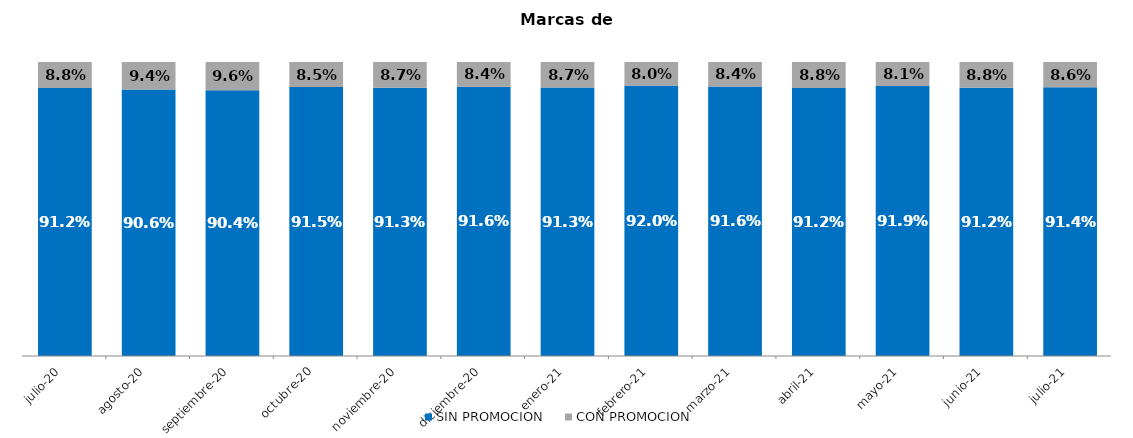
| Category | SIN PROMOCION   | CON PROMOCION   |
|---|---|---|
| 2020-07-01 | 0.912 | 0.088 |
| 2020-08-01 | 0.906 | 0.094 |
| 2020-09-01 | 0.904 | 0.096 |
| 2020-10-01 | 0.915 | 0.085 |
| 2020-11-01 | 0.913 | 0.087 |
| 2020-12-01 | 0.916 | 0.084 |
| 2021-01-01 | 0.913 | 0.087 |
| 2021-02-01 | 0.92 | 0.08 |
| 2021-03-01 | 0.916 | 0.084 |
| 2021-04-01 | 0.912 | 0.088 |
| 2021-05-01 | 0.919 | 0.081 |
| 2021-06-01 | 0.912 | 0.088 |
| 2021-07-01 | 0.914 | 0.086 |